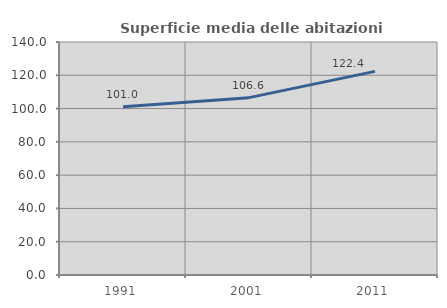
| Category | Superficie media delle abitazioni occupate |
|---|---|
| 1991.0 | 101.04 |
| 2001.0 | 106.569 |
| 2011.0 | 122.364 |